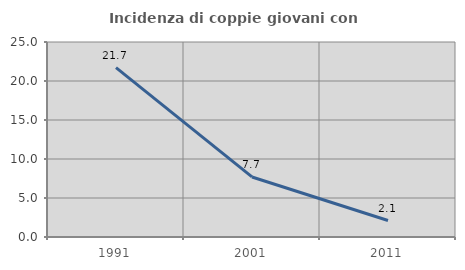
| Category | Incidenza di coppie giovani con figli |
|---|---|
| 1991.0 | 21.707 |
| 2001.0 | 7.699 |
| 2011.0 | 2.113 |